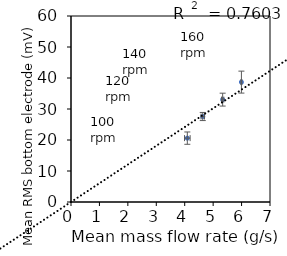
| Category | Series 0 |
|---|---|
| 4.091933333333333 | 20.603 |
| 4.634966666666666 | 27.577 |
| 5.334866666666667 | 33.026 |
| 5.994566666666667 | 38.676 |